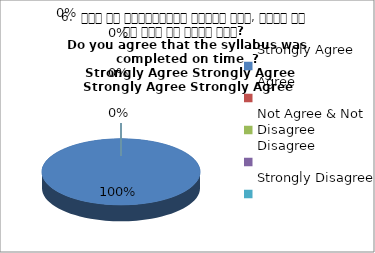
| Category | 6.  समय पर पाठ्यक्रम पूर्ण हुआ, क्या आप इस बात से सहमत हैं? 
Do you agree that the syllabus was completed on time  ?
 Strongly Agree Strongly Agree Strongly Agree Strongly Agree |
|---|---|
| Strongly Agree | 4 |
| Agree | 0 |
| Not Agree & Not Disagree | 0 |
| Disagree | 0 |
| Strongly Disagree | 0 |